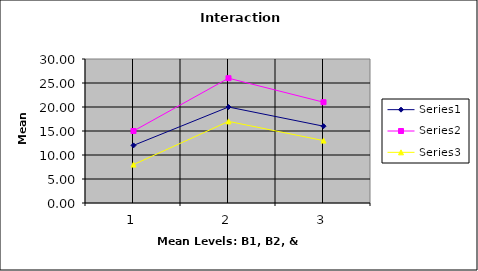
| Category | Series 0 | Series 1 | Series 2 |
|---|---|---|---|
| 0 | 12 | 15 | 8 |
| 1 | 20 | 26 | 17 |
| 2 | 16 | 21 | 13 |